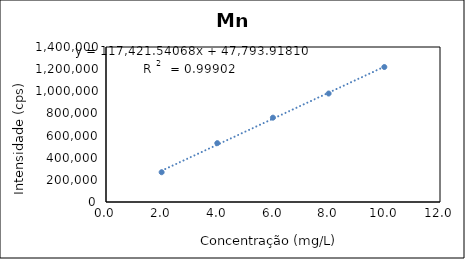
| Category | Series 0 |
|---|---|
| 1.9992234728903477 | 268882.725 |
| 3.998410641128061 | 531498.725 |
| 5.997016679272077 | 761615.725 |
| 7.998956615741081 | 979777.725 |
| 10.000174091351157 | 1219110.725 |